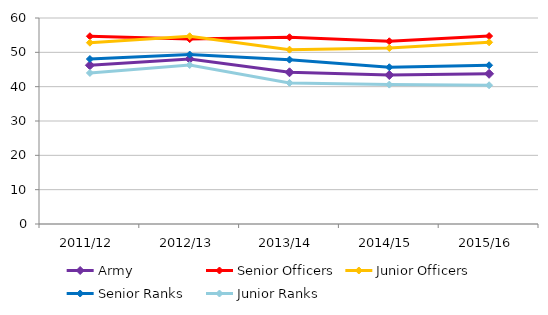
| Category | Army | Senior Officers | Junior Officers | Senior Ranks | Junior Ranks |
|---|---|---|---|---|---|
| 2011/12 | 46.241 | 54.69 | 52.809 | 48.051 | 43.998 |
| 2012/13 | 48.066 | 53.863 | 54.677 | 49.347 | 46.314 |
| 2013/14 | 44.186 | 54.39 | 50.782 | 47.866 | 41.101 |
| 2014/15 | 43.392 | 53.217 | 51.254 | 45.655 | 40.602 |
| 2015/16 | 43.744 | 54.736 | 52.916 | 46.229 | 40.412 |